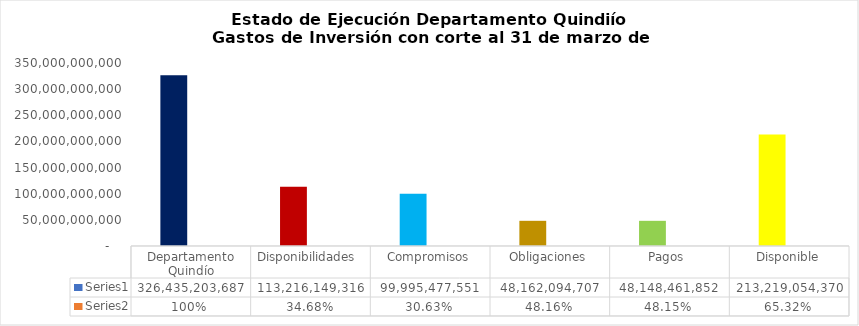
| Category | Series 0 | Series 1 |
|---|---|---|
| Departamento Quindío | 326435203686.56 | 1 |
| Disponibilidades  | 113216149316.14 | 0.347 |
| Compromisos | 99995477550.94 | 0.306 |
| Obligaciones | 48162094707.14 | 0.482 |
| Pagos  | 48148461852.14 | 0.482 |
| Disponible | 213219054370.42 | 0.653 |